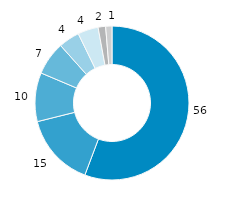
| Category | Rheinland-Pfalz |
|---|---|
| gesetzliche
Kranken-versicherung | 55.739 |
| private Haushalte u. private Organi-sationen o. E. | 15.372 |
| private
Kranken-versicherung | 10.26 |
| soziale Pflegeversicherung | 7.016 |
| öffentliche Haushalte | 4.408 |
| Arbeitgeber | 4.304 |
| gesetzliche Unfallversicherung | 1.579 |
| gesetzliche
Renten-
versicherung | 1.322 |